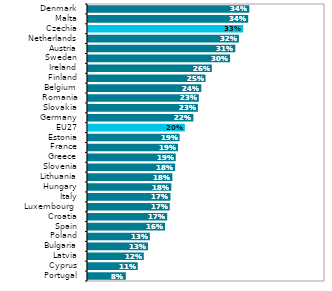
| Category | Series 1 |
|---|---|
| Portugal | 0.08 |
| Cyprus | 0.105 |
| Latvia | 0.118 |
| Bulgaria | 0.127 |
| Poland | 0.13 |
| Spain | 0.162 |
| Croatia | 0.167 |
| Luxembourg  | 0.172 |
| Italy | 0.174 |
| Hungary | 0.176 |
| Lithuania | 0.178 |
| Slovenia | 0.184 |
| Greece | 0.185 |
| France | 0.19 |
| Estonia | 0.193 |
| EU27 | 0.204 |
| Germany | 0.222 |
| Slovakia | 0.232 |
| Romania | 0.234 |
| Belgium | 0.239 |
| Finland | 0.248 |
| Ireland | 0.261 |
| Sweden | 0.3 |
| Austria | 0.311 |
| Netherlands | 0.318 |
| Czechia | 0.328 |
| Malta | 0.338 |
| Denmark | 0.34 |